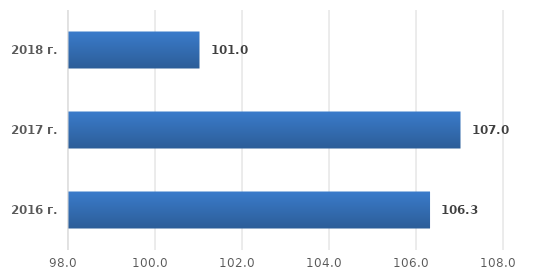
| Category | Series 0 |
|---|---|
| 2016 г. | 106.3 |
| 2017 г. | 107 |
| 2018 г. | 101 |